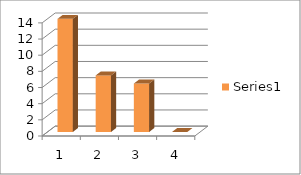
| Category | Series 0 |
|---|---|
| 0 | 14 |
| 1 | 7 |
| 2 | 6 |
| 3 | 0 |